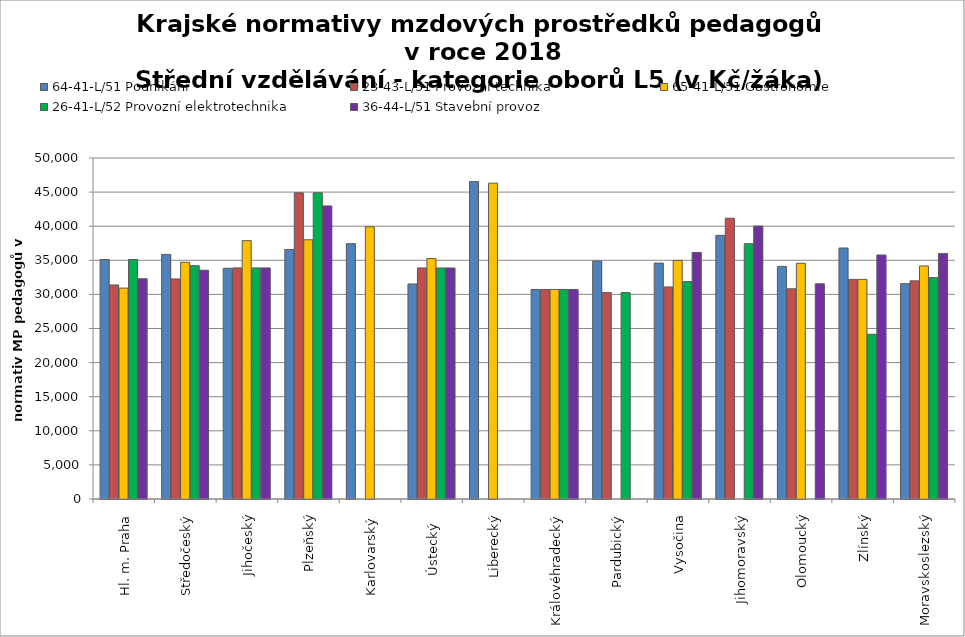
| Category | 64-41-L/51 Podnikání | 23-43-L/51 Provozní technika | 65-41-L/51 Gastronomie | 26-41-L/52 Provozní elektrotechnika | 36-44-L/51 Stavební provoz |
|---|---|---|---|---|---|
| Hl. m. Praha | 35115.254 | 31390.909 | 30922.388 | 35115.254 | 32296.181 |
| Středočeský | 35865.688 | 32271.616 | 34700.739 | 34218.093 | 33544.048 |
| Jihočeský | 33829.026 | 33887.043 | 37878.306 | 33887.043 | 33887.043 |
| Plzeňský | 36589.324 | 44897.817 | 38009.612 | 44897.817 | 42974.295 |
| Karlovarský  | 37440.945 | 0 | 39916.055 | 0 | 0 |
| Ústecký   | 31526.817 | 33875.763 | 35268.785 | 33875.763 | 33875.763 |
| Liberecký | 46537.693 | 0 | 46315.618 | 0 | 0 |
| Královéhradecký | 30725.346 | 30725.346 | 30725.346 | 30725.346 | 30725.346 |
| Pardubický | 34894.82 | 30270.526 | 0 | 30270.526 | 0 |
| Vysočina | 34594.309 | 31094.877 | 34981.737 | 31873.469 | 36149.559 |
| Jihomoravský | 38650.353 | 41168.68 | 0 | 37433.983 | 40014.695 |
| Olomoucký | 34107.349 | 30823.881 | 34564.017 | 0 | 31553.858 |
| Zlínský | 36803.429 | 32203 | 32203 | 24152.25 | 35781.111 |
| Moravskoslezský | 31570.776 | 31984.58 | 34171.334 | 32460.094 | 35979.185 |